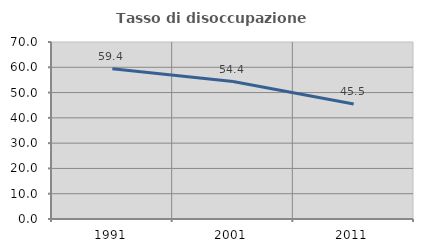
| Category | Tasso di disoccupazione giovanile  |
|---|---|
| 1991.0 | 59.427 |
| 2001.0 | 54.375 |
| 2011.0 | 45.455 |